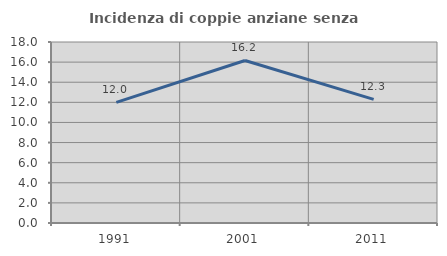
| Category | Incidenza di coppie anziane senza figli  |
|---|---|
| 1991.0 | 12 |
| 2001.0 | 16.162 |
| 2011.0 | 12.299 |